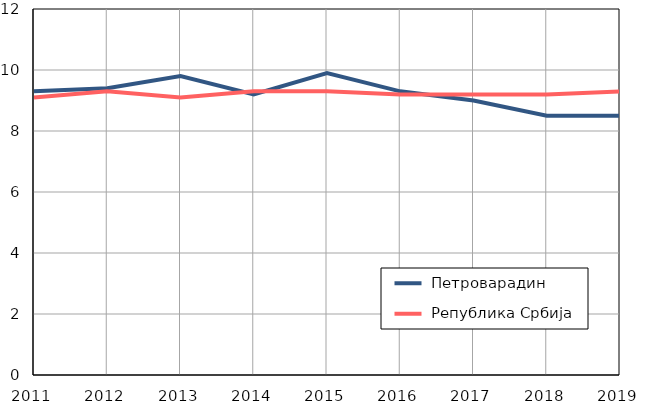
| Category |  Петроварадин |  Република Србија |
|---|---|---|
| 2011.0 | 9.3 | 9.1 |
| 2012.0 | 9.4 | 9.3 |
| 2013.0 | 9.8 | 9.1 |
| 2014.0 | 9.2 | 9.3 |
| 2015.0 | 9.9 | 9.3 |
| 2016.0 | 9.3 | 9.2 |
| 2017.0 | 9 | 9.2 |
| 2018.0 | 8.5 | 9.2 |
| 2019.0 | 8.5 | 9.3 |